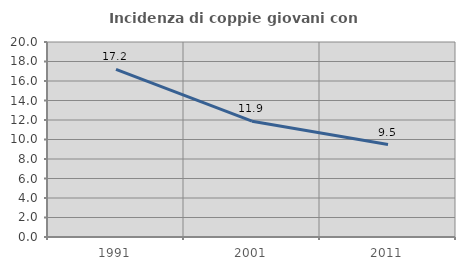
| Category | Incidenza di coppie giovani con figli |
|---|---|
| 1991.0 | 17.191 |
| 2001.0 | 11.878 |
| 2011.0 | 9.479 |